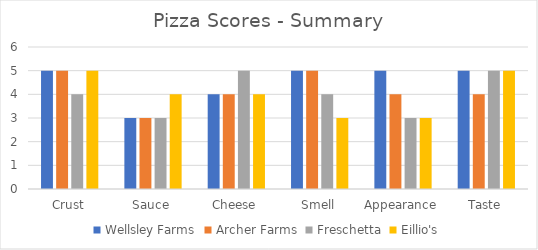
| Category | Wellsley Farms | Archer Farms | Freschetta | Eillio's |
|---|---|---|---|---|
| Crust | 5 | 5 | 4 | 5 |
| Sauce | 3 | 3 | 3 | 4 |
| Cheese | 4 | 4 | 5 | 4 |
| Smell | 5 | 5 | 4 | 3 |
| Appearance | 5 | 4 | 3 | 3 |
| Taste | 5 | 4 | 5 | 5 |